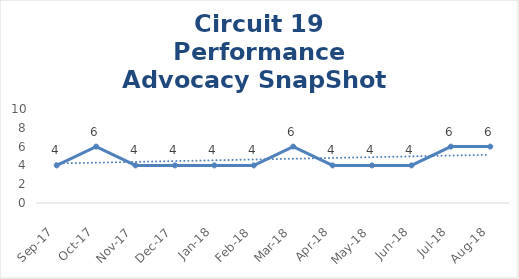
| Category | Circuit 19 |
|---|---|
| Sep-17 | 4 |
| Oct-17 | 6 |
| Nov-17 | 4 |
| Dec-17 | 4 |
| Jan-18 | 4 |
| Feb-18 | 4 |
| Mar-18 | 6 |
| Apr-18 | 4 |
| May-18 | 4 |
| Jun-18 | 4 |
| Jul-18 | 6 |
| Aug-18 | 6 |